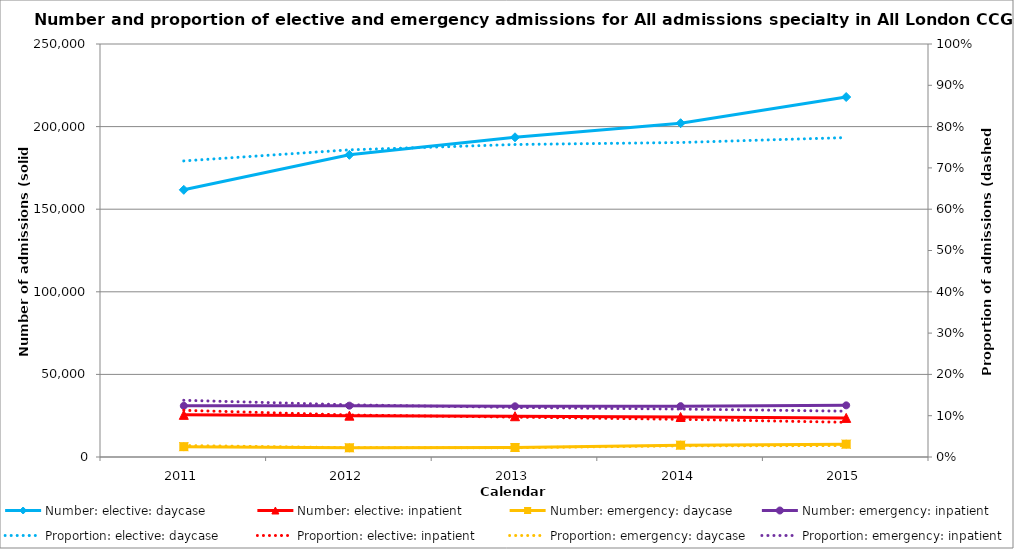
| Category | Number: elective: daycase | Number: elective: inpatient | Number: emergency: daycase | Number: emergency: inpatient |
|---|---|---|---|---|
| 2011.0 | 161725 | 25504 | 6258 | 30973 |
| 2012.0 | 182901 | 25026 | 5578 | 31086 |
| 2013.0 | 193540 | 24679 | 5737 | 30679 |
| 2014.0 | 202059 | 24204 | 7157 | 30787 |
| 2015.0 | 217900 | 23669 | 7765 | 31265 |